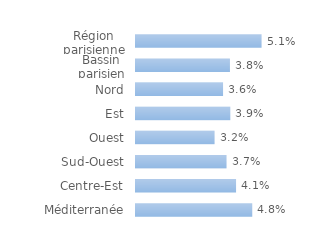
| Category | Series 0 |
|---|---|
| Région parisienne | 0.051 |
| Bassin parisien | 0.038 |
| Nord | 0.036 |
| Est | 0.039 |
| Ouest | 0.032 |
| Sud-Ouest | 0.037 |
| Centre-Est | 0.041 |
| Méditerranée | 0.048 |